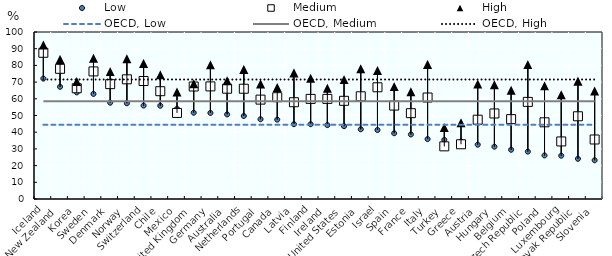
| Category | Low | Medium | High |
|---|---|---|---|
| Iceland | 72.11 | 87.55 | 92.238 |
| New Zealand | 67.189 | 77.95 | 83.553 |
| Korea | 63.839 | 66.314 | 70.353 |
| Sweden | 62.921 | 76.401 | 84.302 |
| Denmark | 57.665 | 68.777 | 76.316 |
| Norway | 57.327 | 71.669 | 83.913 |
| Switzerland | 55.951 | 70.655 | 81.205 |
| Chile | 55.851 | 64.557 | 74.358 |
| Mexico | 54.001 | 51.539 | 64.114 |
| United Kingdom | 51.66 | 67.358 | 69.011 |
| Germany | 51.535 | 67.428 | 80.349 |
| Australia | 50.653 | 66.039 | 70.856 |
| Netherlands | 49.705 | 66.037 | 77.573 |
| Portugal | 47.764 | 59.513 | 68.909 |
| Canada | 47.518 | 60.972 | 66.711 |
| Latvia | 44.807 | 57.94 | 75.454 |
| Finland | 44.776 | 59.939 | 72.325 |
| Ireland | 44.262 | 59.951 | 66.322 |
| United States | 43.604 | 58.794 | 71.511 |
| Estonia | 41.756 | 61.501 | 77.962 |
| Israel | 41.31 | 66.893 | 76.927 |
| Spain | 39.376 | 55.936 | 67.327 |
| France | 38.656 | 51.403 | 64.225 |
| Italy | 35.868 | 60.768 | 80.605 |
| Turkey | 35.408 | 31.528 | 42.808 |
| Greece | 34.532 | 32.784 | 45.633 |
| Austria | 32.534 | 47.485 | 68.862 |
| Hungary | 31.329 | 51.209 | 68.443 |
| Belgium | 29.474 | 47.829 | 65.107 |
| Czech Republic | 28.372 | 58.14 | 80.469 |
| Poland | 26.093 | 45.923 | 67.746 |
| Luxembourg | 25.933 | 34.464 | 62.399 |
| Slovak Republic | 24.071 | 49.538 | 70.542 |
| Slovenia | 23.187 | 35.635 | 64.702 |